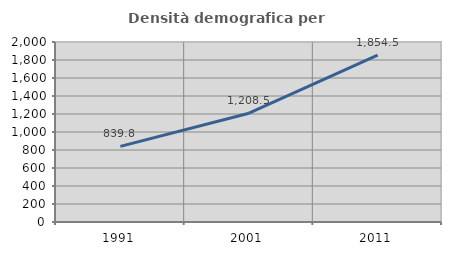
| Category | Densità demografica |
|---|---|
| 1991.0 | 839.805 |
| 2001.0 | 1208.536 |
| 2011.0 | 1854.54 |